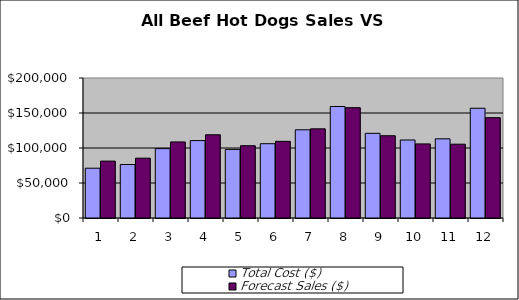
| Category | Total Cost ($) | Forecast Sales ($) |
|---|---|---|
| 0 | 71120 | 81280 |
| 1 | 76440 | 85449 |
| 2 | 99120 | 108678 |
| 3 | 110600 | 118895 |
| 4 | 98000 | 103250 |
| 5 | 106120 | 109531 |
| 6 | 126000 | 127350 |
| 7 | 159320 | 157613 |
| 8 | 120960 | 117504 |
| 9 | 111440 | 105868 |
| 10 | 113120 | 105444 |
| 11 | 156800 | 143360 |